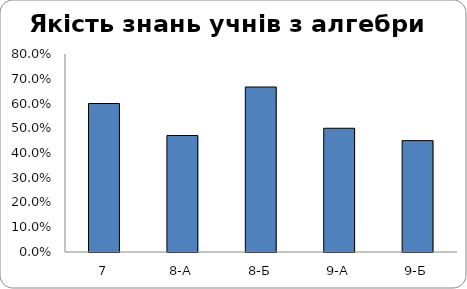
| Category | Series 0 |
|---|---|
| 7 | 0.6 |
| 8-А | 0.471 |
| 8-Б | 0.667 |
| 9-А | 0.5 |
| 9-Б | 0.45 |